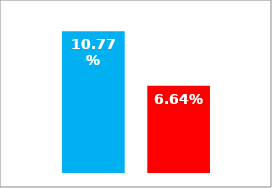
| Category | Series 0 | Series 1 |
|---|---|---|
| 0 | 0.108 | 0.066 |